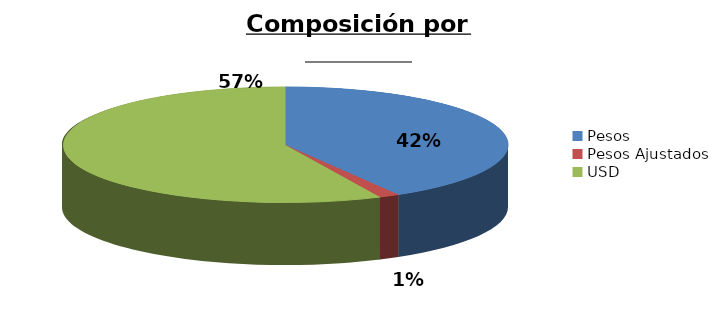
| Category | % | Millones ARS |
|---|---|---|
| Pesos | 0.415 | 20720.808 |
| Pesos Ajustados | 0.015 | 738.382 |
| USD | 0.57 | 28438.476 |